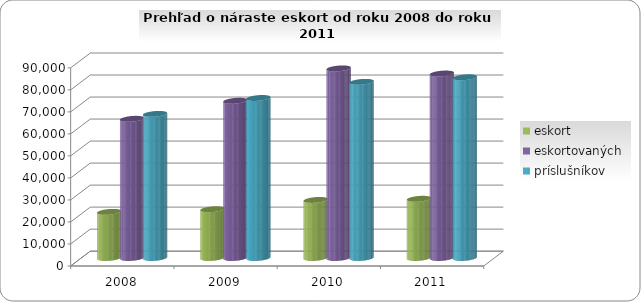
| Category | eskort | eskortovaných | príslušníkov |
|---|---|---|---|
| 2008.0 | 20952 | 63214 | 65452 |
| 2009.0 | 22141 | 71414 | 72678 |
| 2010.0 | 26377 | 86105 | 80003 |
| 2011.0 | 26897 | 83785 | 82085 |